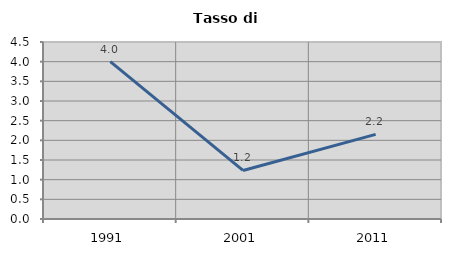
| Category | Tasso di disoccupazione   |
|---|---|
| 1991.0 | 4 |
| 2001.0 | 1.235 |
| 2011.0 | 2.151 |